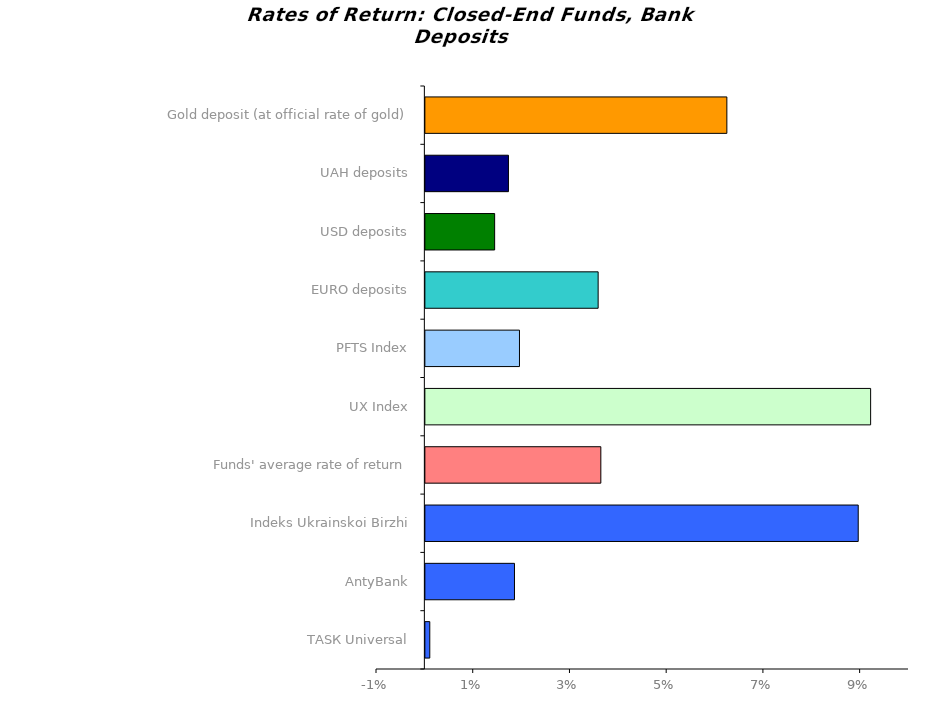
| Category | Series 0 |
|---|---|
| ТАSК Universal | 0.001 |
| AntyBank | 0.018 |
| Indeks Ukrainskoi Birzhi | 0.09 |
| Funds' average rate of return | 0.036 |
| UX Index | 0.092 |
| PFTS Index | 0.019 |
| EURO deposits | 0.036 |
| USD deposits | 0.014 |
| UAH deposits | 0.017 |
| Gold deposit (at official rate of gold) | 0.062 |